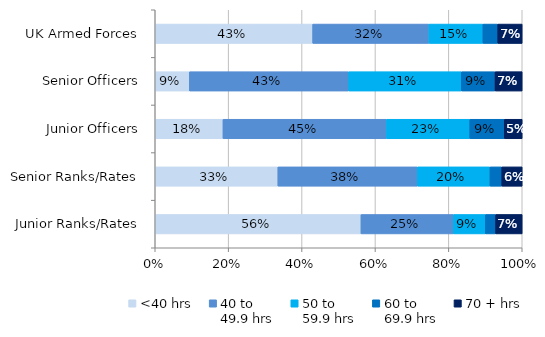
| Category | <40 hrs | 40 to 
49.9 hrs | 50 to 
59.9 hrs | 60 to 
69.9 hrs | 70 + hrs |
|---|---|---|---|---|---|
| UK Armed Forces | 0.429 | 0.317 | 0.147 | 0.04 | 0.067 |
| Senior Officers | 0.093 | 0.434 | 0.307 | 0.092 | 0.074 |
| Junior Officers | 0.185 | 0.446 | 0.227 | 0.094 | 0.049 |
| Senior Ranks/Rates | 0.334 | 0.38 | 0.198 | 0.032 | 0.056 |
| Junior Ranks/Rates | 0.561 | 0.252 | 0.087 | 0.028 | 0.072 |